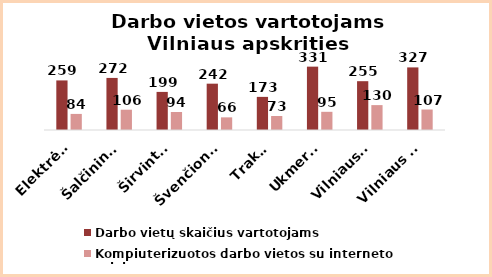
| Category | Darbo vietų skaičius vartotojams | Kompiuterizuotos darbo vietos su interneto prieiga |
|---|---|---|
| Elektrėnai | 259 | 84 |
| Šalčininkai | 272 | 106 |
| Širvintos | 199 | 94 |
| Švenčionys | 242 | 66 |
| Trakai | 173 | 73 |
| Ukmergė | 331 | 95 |
| Vilniaus r. | 255 | 130 |
| Vilniaus m. | 327 | 107 |